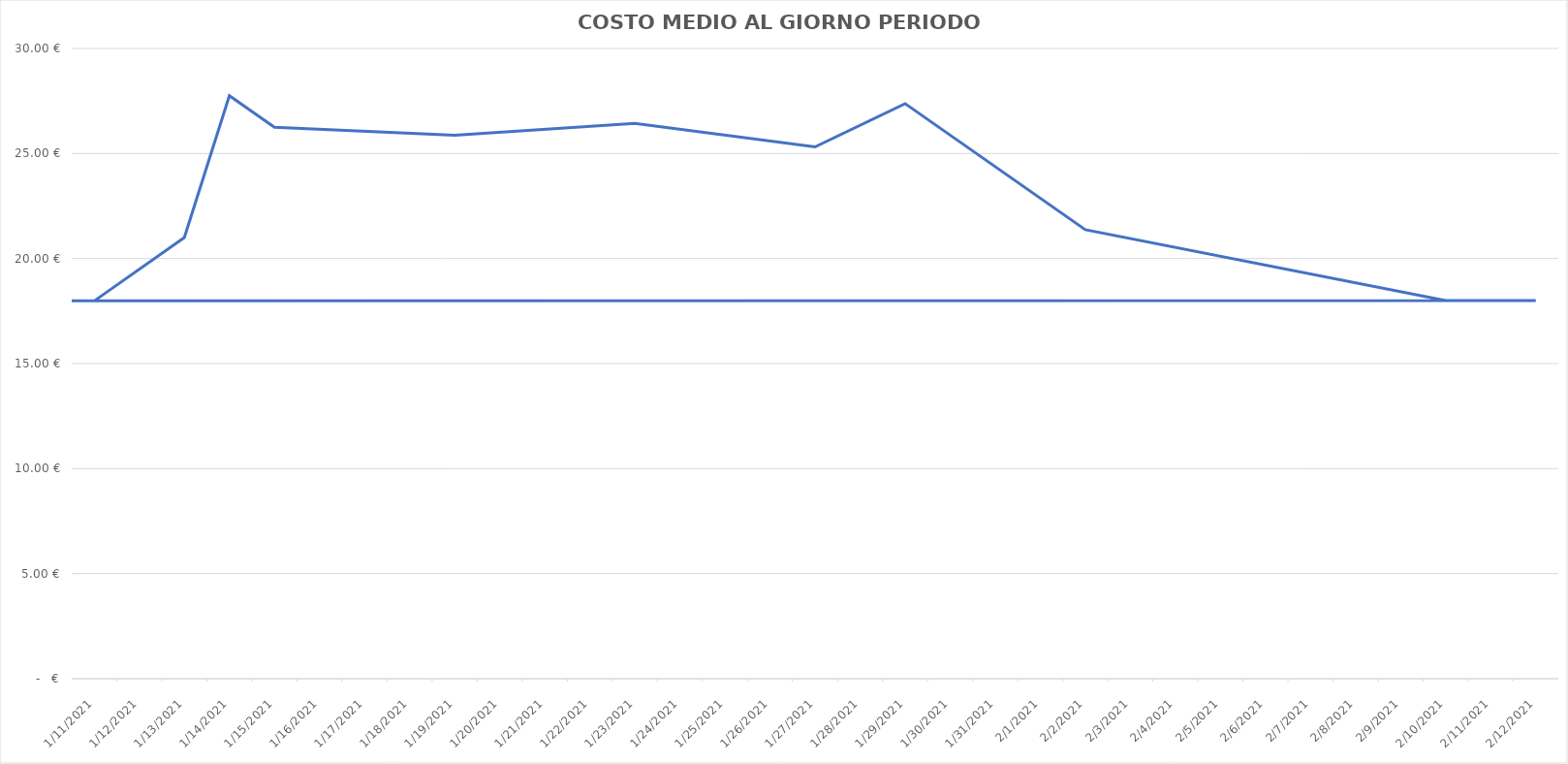
| Category | Series 0 |
|---|---|
| 1/11/21 | 17.982 |
| 1/13/21 | 21 |
| 1/14/21 | 27.75 |
| 1/15/21 | 26.25 |
| 1/19/21 | 25.875 |
| 1/23/21 | 26.438 |
| 1/27/21 | 25.312 |
| 1/29/21 | 27.375 |
| 2/2/21 | 21.375 |
| 2/10/21 | 18 |
| 2/12/21 | 18 |
| nan | 0 |
| nan | 0 |
| nan | 0 |
| nan | 0 |
| nan | 0 |
| nan | 0 |
| nan | 0 |
| nan | 0 |
| nan | 0 |
| nan | 0 |
| nan | 0 |
| nan | 0 |
| nan | 0 |
| nan | 0 |
| nan | 0 |
| nan | 0 |
| nan | 0 |
| nan | 0 |
| nan | 0 |
| nan | 0 |
| nan | 0 |
| nan | 0 |
| nan | 0 |
| nan | 0 |
| nan | 0 |
| nan | 0 |
| nan | 0 |
| nan | 0 |
| nan | 0 |
| nan | 0 |
| nan | 0 |
| nan | 0 |
| nan | 0 |
| nan | 0 |
| nan | 0 |
| nan | 0 |
| nan | 0 |
| nan | 0 |
| nan | 0 |
| nan | 0 |
| nan | 0 |
| nan | 0 |
| nan | 0 |
| nan | 0 |
| nan | 0 |
| nan | 0 |
| nan | 0 |
| nan | 0 |
| nan | 0 |
| nan | 0 |
| nan | 0 |
| nan | 0 |
| nan | 0 |
| nan | 0 |
| nan | 0 |
| nan | 0 |
| nan | 0 |
| nan | 0 |
| nan | 0 |
| nan | 0 |
| nan | 0 |
| nan | 0 |
| nan | 0 |
| nan | 0 |
| nan | 0 |
| nan | 0 |
| nan | 0 |
| nan | 0 |
| nan | 0 |
| nan | 0 |
| nan | 0 |
| nan | 0 |
| nan | 0 |
| nan | 0 |
| nan | 0 |
| nan | 0 |
| nan | 0 |
| nan | 0 |
| nan | 0 |
| nan | 0 |
| nan | 0 |
| nan | 0 |
| nan | 0 |
| nan | 0 |
| nan | 0 |
| nan | 0 |
| nan | 0 |
| nan | 0 |
| nan | 0 |
| nan | 0 |
| nan | 0 |
| nan | 0 |
| nan | 0 |
| nan | 0 |
| nan | 0 |
| nan | 0 |
| nan | 0 |
| nan | 0 |
| nan | 0 |
| nan | 0 |
| nan | 0 |
| nan | 0 |
| nan | 0 |
| nan | 0 |
| nan | 0 |
| nan | 0 |
| nan | 0 |
| nan | 0 |
| nan | 0 |
| nan | 0 |
| nan | 0 |
| nan | 0 |
| nan | 0 |
| nan | 0 |
| nan | 0 |
| nan | 0 |
| nan | 0 |
| nan | 0 |
| nan | 0 |
| nan | 0 |
| nan | 0 |
| nan | 0 |
| nan | 0 |
| nan | 0 |
| nan | 0 |
| nan | 0 |
| nan | 0 |
| nan | 0 |
| nan | 0 |
| nan | 0 |
| nan | 0 |
| nan | 0 |
| nan | 0 |
| nan | 0 |
| nan | 0 |
| nan | 0 |
| nan | 0 |
| nan | 0 |
| nan | 0 |
| nan | 0 |
| nan | 0 |
| nan | 0 |
| nan | 0 |
| nan | 0 |
| nan | 0 |
| nan | 0 |
| nan | 0 |
| nan | 0 |
| nan | 0 |
| nan | 0 |
| nan | 0 |
| nan | 0 |
| nan | 0 |
| nan | 0 |
| nan | 0 |
| nan | 0 |
| nan | 0 |
| nan | 0 |
| nan | 0 |
| nan | 0 |
| nan | 0 |
| nan | 0 |
| nan | 0 |
| nan | 0 |
| nan | 0 |
| nan | 0 |
| nan | 0 |
| nan | 0 |
| nan | 0 |
| nan | 0 |
| nan | 0 |
| nan | 0 |
| nan | 0 |
| nan | 0 |
| nan | 0 |
| nan | 0 |
| nan | 0 |
| nan | 0 |
| nan | 0 |
| nan | 0 |
| nan | 0 |
| nan | 0 |
| nan | 0 |
| nan | 0 |
| nan | 0 |
| nan | 0 |
| nan | 0 |
| nan | 0 |
| nan | 0 |
| nan | 0 |
| nan | 0 |
| nan | 0 |
| nan | 0 |
| nan | 0 |